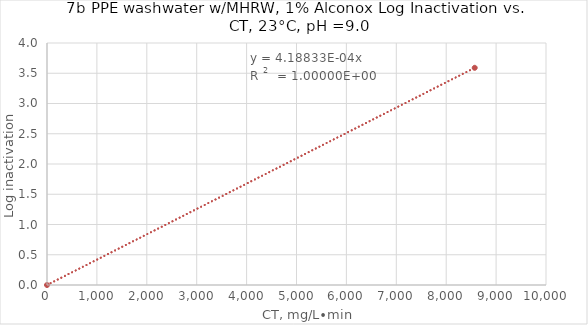
| Category | Series 1 |
|---|---|
| 0.0 | 0 |
| 8571.428571428572 | 3.59 |